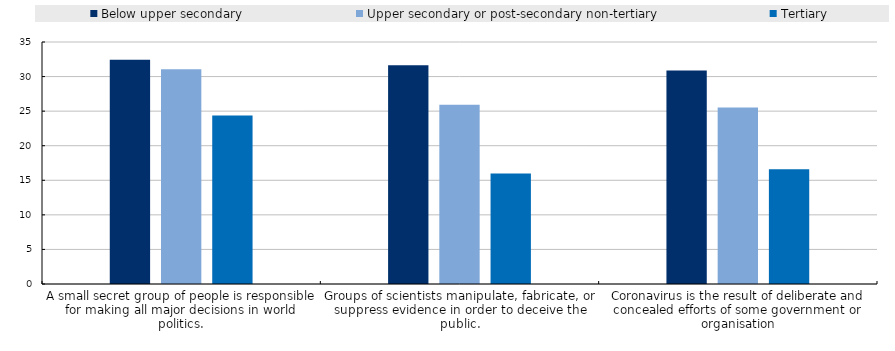
| Category | Below upper secondary | Upper secondary or post-secondary non-tertiary | Tertiary |
|---|---|---|---|
| A small secret group of people is responsible for making all major decisions in world politics. | 32.451 | 31.075 | 24.378 |
| Groups of scientists manipulate, fabricate, or suppress evidence in order to deceive the public. | 31.621 | 25.925 | 15.995 |
| Coronavirus is the result of deliberate and concealed efforts of some government or organisation | 30.895 | 25.535 | 16.602 |